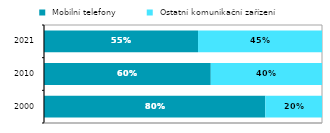
| Category |  Mobilní telefony |  Ostatní komunikační zařízení |
|---|---|---|
| 2000.0 | 0.796 | 0.204 |
| 2010.0 | 0.6 | 0.4 |
| 2021.0 | 0.554 | 0.446 |